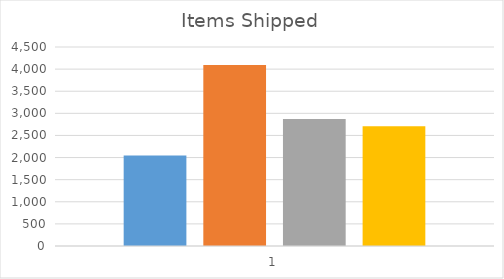
| Category | Series 0 | Series 1 | Series 2 | Series 3 |
|---|---|---|---|---|
| 0 | 2048 | 4094 | 2871 | 2709 |